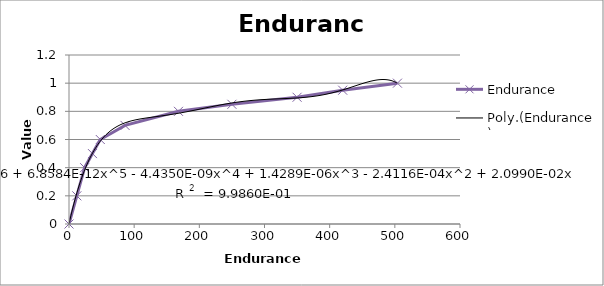
| Category | Endurance |
|---|---|
| 0.0 | 0 |
| 12.0 | 0.2 |
| 24.0 | 0.4 |
| 36.0 | 0.5 |
| 48.0 | 0.6 |
| 86.0 | 0.7 |
| 168.0 | 0.8 |
| 250.0 | 0.85 |
| 350.0 | 0.9 |
| 420.0 | 0.95 |
| 504.0 | 1 |